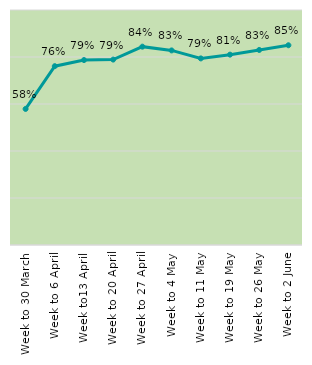
| Category | Series 0 |
|---|---|
| Week to 30 March | 0.579 |
| Week to 6 April | 0.761 |
| Week to13 April | 0.787 |
| Week to 20 April | 0.789 |
| Week to 27 April | 0.844 |
| Week to 4 May | 0.828 |
| Week to 11 May | 0.794 |
| Week to 19 May | 0.81 |
| Week to 26 May | 0.83 |
| Week to 2 June | 0.85 |